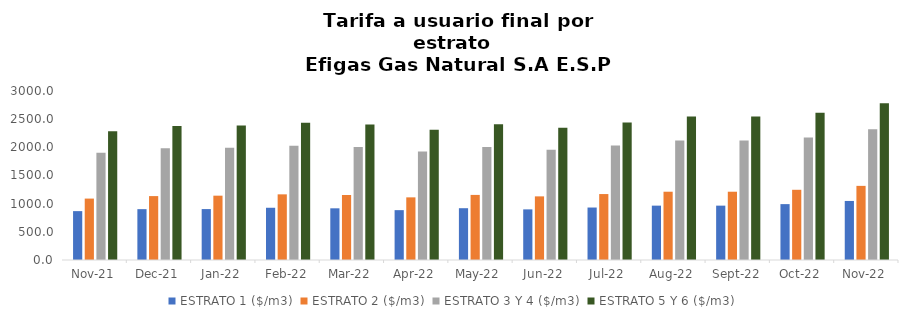
| Category | ESTRATO 1 ($/m3) | ESTRATO 2 ($/m3) | ESTRATO 3 Y 4 ($/m3) | ESTRATO 5 Y 6 ($/m3) |
|---|---|---|---|---|
| 2021-11-01 | 867.65 | 1090.23 | 1904.78 | 2285.736 |
| 2021-12-01 | 902.63 | 1134.54 | 1983.18 | 2379.816 |
| 2022-01-01 | 904.05 | 1141.94 | 1991.19 | 2389.428 |
| 2022-02-01 | 927.29 | 1165.44 | 2029.87 | 2435.844 |
| 2022-03-01 | 917.57 | 1153.65 | 2006.27 | 2407.524 |
| 2022-04-01 | 884.99 | 1111.99 | 1925.89 | 2311.068 |
| 2022-05-01 | 919.5 | 1155.39 | 2006.32 | 2407.584 |
| 2022-06-01 | 898.69 | 1129.49 | 1956.87 | 2348.244 |
| 2022-07-01 | 931.44 | 1170.63 | 2033.52 | 2440.224 |
| 2022-08-01 | 964.95 | 1212.1 | 2121.38 | 2545.656 |
| 2022-09-01 | 964.95 | 1212.1 | 2121.38 | 2545.656 |
| 2022-10-01 | 992.06 | 1246.38 | 2176.65 | 2611.98 |
| 2022-11-01 | 1048.08 | 1315.96 | 2318.8 | 2782.56 |